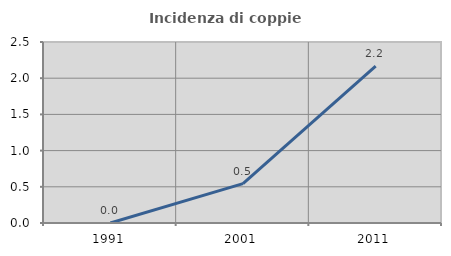
| Category | Incidenza di coppie miste |
|---|---|
| 1991.0 | 0 |
| 2001.0 | 0.544 |
| 2011.0 | 2.166 |